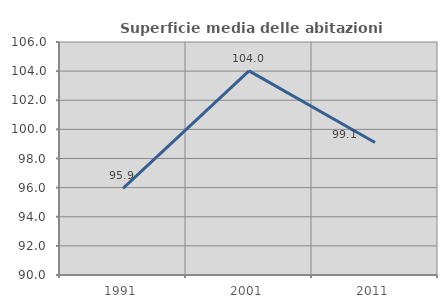
| Category | Superficie media delle abitazioni occupate |
|---|---|
| 1991.0 | 95.942 |
| 2001.0 | 104.017 |
| 2011.0 | 99.102 |